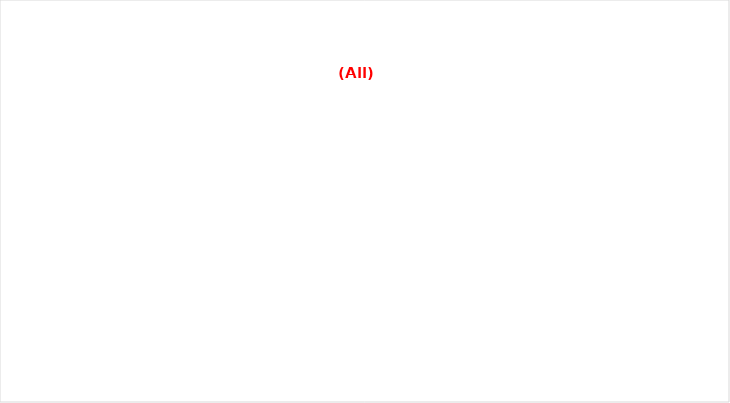
| Category | Total |
|---|---|
| Spring | 94 |